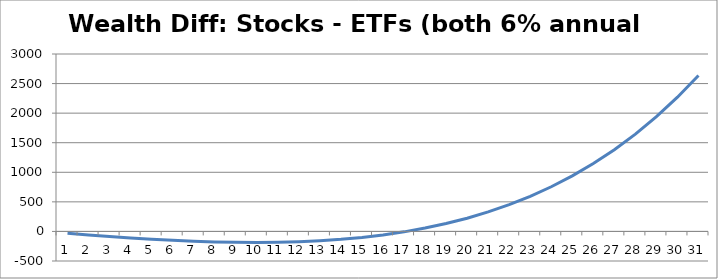
| Category | Wealth Diff: Stocks - ETFs (both 6% annual growth) |
|---|---|
| 0 | -30 |
| 1 | -58.408 |
| 2 | -84.931 |
| 3 | -109.246 |
| 4 | -130.999 |
| 5 | -149.803 |
| 6 | -165.231 |
| 7 | -176.82 |
| 8 | -184.061 |
| 9 | -186.398 |
| 10 | -183.228 |
| 11 | -173.889 |
| 12 | -157.662 |
| 13 | -133.767 |
| 14 | -101.353 |
| 15 | -59.494 |
| 16 | -7.188 |
| 17 | 56.656 |
| 18 | 133.219 |
| 19 | 223.782 |
| 20 | 329.734 |
| 21 | 452.58 |
| 22 | 593.946 |
| 23 | 755.594 |
| 24 | 939.429 |
| 25 | 1147.51 |
| 26 | 1382.063 |
| 27 | 1645.492 |
| 28 | 1940.391 |
| 29 | 2269.563 |
| 30 | 2636.031 |